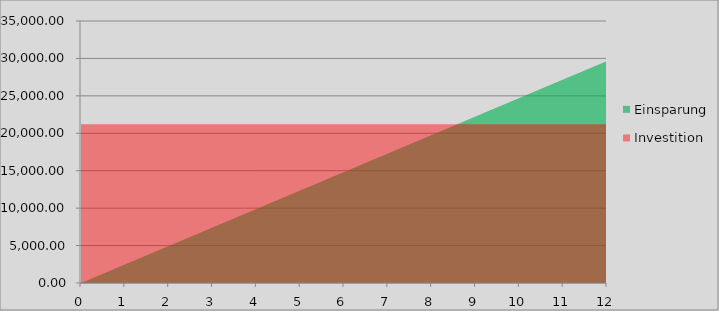
| Category | Einsparung | Investition |
|---|---|---|
| 0.0 | 0 | 21220 |
| 1.0 | 2470 | 21220 |
| 2.0 | 4940 | 21220 |
| 3.0 | 7410 | 21220 |
| 4.0 | 9880 | 21220 |
| 5.0 | 12350 | 21220 |
| 6.0 | 14820 | 21220 |
| 7.0 | 17290 | 21220 |
| 8.0 | 19760 | 21220 |
| 9.0 | 22230 | 21220 |
| 10.0 | 24700 | 21220 |
| 11.0 | 27170 | 21220 |
| 12.0 | 29640 | 21220 |